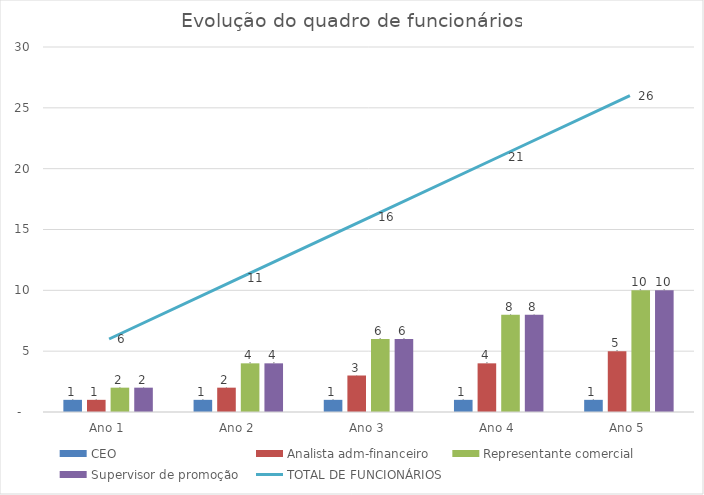
| Category |  CEO  |  Analista adm-financeiro  |  Representante comercial  |  Supervisor de promoção  |
|---|---|---|---|---|
|  Ano 1  | 1 | 1 | 2 | 2 |
|  Ano 2  | 1 | 2 | 4 | 4 |
|  Ano 3  | 1 | 3 | 6 | 6 |
|  Ano 4  | 1 | 4 | 8 | 8 |
|  Ano 5  | 1 | 5 | 10 | 10 |